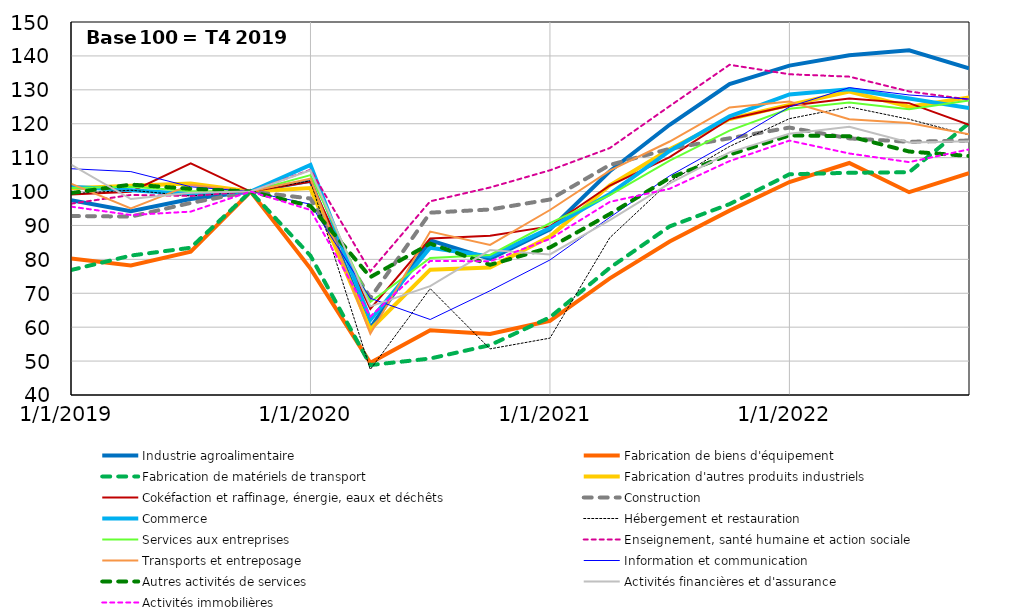
| Category | Industrie agroalimentaire | Fabrication de biens d'équipement | Fabrication de matériels de transport | Fabrication d'autres produits industriels | Cokéfaction et raffinage, énergie, eaux et déchêts | Construction | Commerce | Hébergement et restauration | Services aux entreprises | Enseignement, santé humaine et action sociale | Transports et entreposage | Information et communication | Autres activités de services | Activités financières et d'assurance | Activités immobilières |
|---|---|---|---|---|---|---|---|---|---|---|---|---|---|---|---|
| 1/1/19 | 97.435 | 80.256 | 76.845 | 100.989 | 99.146 | 92.804 | 101.43 | 99.386 | 101.031 | 96.419 | 102.34 | 106.735 | 99.555 | 107.939 | 95.555 |
| 4/1/19 | 94.197 | 78.23 | 81.119 | 101.699 | 99.965 | 92.604 | 100.383 | 100.397 | 101.383 | 98.99 | 95.026 | 105.875 | 102.051 | 97.79 | 93.083 |
| 7/1/19 | 97.82 | 82.241 | 83.429 | 102.342 | 108.288 | 96.647 | 99.277 | 98.683 | 100.129 | 98.703 | 101.959 | 101.399 | 100.81 | 99.634 | 94.079 |
| 10/1/19 | 100 | 100 | 100 | 100 | 100 | 100 | 100 | 100 | 100 | 100 | 100 | 100 | 100 | 100 | 100 |
| 1/1/20 | 103.179 | 77.29 | 81.065 | 101.008 | 102.884 | 97.947 | 107.833 | 103.166 | 104.852 | 106.417 | 103.765 | 96.267 | 95.737 | 106.253 | 94.566 |
| 4/1/20 | 59.742 | 49.516 | 48.823 | 59.334 | 65.363 | 68.593 | 62.128 | 47.532 | 67.399 | 76.462 | 58.064 | 68.531 | 74.768 | 66.15 | 63.14 |
| 7/1/20 | 85.622 | 59.093 | 50.752 | 76.961 | 86.158 | 93.773 | 83.448 | 71.372 | 80.429 | 97.129 | 88.196 | 62.264 | 84.653 | 72.123 | 79.543 |
| 10/1/20 | 80.134 | 58 | 54.705 | 77.568 | 86.931 | 94.709 | 80.834 | 53.602 | 81.313 | 101.203 | 84.28 | 70.748 | 78.4 | 82.742 | 79.427 |
| 1/1/21 | 88.821 | 61.891 | 62.905 | 86.717 | 89.73 | 97.646 | 89.229 | 56.767 | 90.717 | 106.264 | 94.551 | 79.82 | 83.504 | 81.465 | 86.028 |
| 4/1/21 | 105.993 | 74.404 | 77.505 | 101.841 | 101.772 | 107.85 | 99.304 | 86.382 | 98.939 | 112.822 | 106.183 | 92.377 | 93.371 | 91.563 | 96.953 |
| 7/1/21 | 119.688 | 85.289 | 89.727 | 112.443 | 110.174 | 112.618 | 111.957 | 102.96 | 109.152 | 125.198 | 114.759 | 104.637 | 104.021 | 102.381 | 100.826 |
| 10/1/21 | 131.689 | 94.376 | 96.297 | 121.398 | 121.398 | 115.708 | 122.181 | 113.298 | 117.954 | 137.383 | 124.799 | 114.468 | 110.885 | 111.539 | 108.978 |
| 1/1/22 | 137.137 | 102.811 | 105.083 | 125.562 | 125.315 | 118.868 | 128.643 | 121.494 | 124.407 | 134.591 | 126.577 | 124.958 | 116.556 | 117.048 | 115.019 |
| 4/1/22 | 140.192 | 108.426 | 105.533 | 129.473 | 127.469 | 115.679 | 130.164 | 124.956 | 126.28 | 133.887 | 121.337 | 130.648 | 116.308 | 119.081 | 111.226 |
| 7/1/22 | 141.671 | 99.809 | 105.691 | 125.04 | 126.079 | 114.674 | 127.463 | 121.311 | 124.286 | 129.523 | 120.235 | 128.485 | 111.807 | 114.443 | 108.674 |
| 10/1/22 | 136.354 | 105.434 | 120.161 | 127.737 | 119.661 | 115.043 | 124.598 | 116.687 | 126.828 | 127.124 | 116.882 | 127.28 | 110.492 | 114.799 | 112.436 |